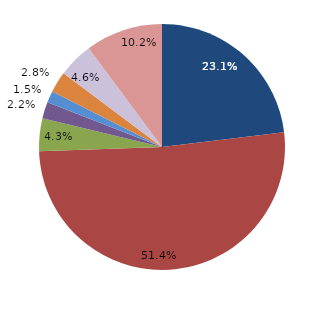
| Category | Series 0 |
|---|---|
| قبل الدخول
Before Consummation | 23.077 |
| -1 | 51.385 |
| 1 | 4.308 |
| 2 | 2.154 |
| 3 | 1.538 |
| 4 | 2.769 |
|  5 - 9 | 4.615 |
| 10+ | 10.154 |